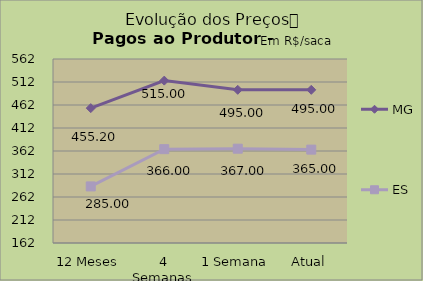
| Category | MG | ES |
|---|---|---|
| 12 Meses | 455.2 | 285 |
| 4 Semanas | 515 | 366 |
| 1 Semana | 495 | 367 |
| Atual | 495 | 365 |